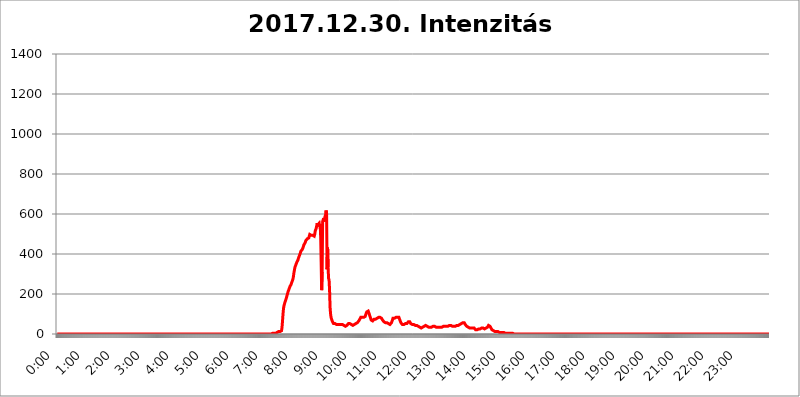
| Category | 2017.12.30. Intenzitás [W/m^2] |
|---|---|
| 0.0 | 0 |
| 0.0006944444444444445 | 0 |
| 0.001388888888888889 | 0 |
| 0.0020833333333333333 | 0 |
| 0.002777777777777778 | 0 |
| 0.003472222222222222 | 0 |
| 0.004166666666666667 | 0 |
| 0.004861111111111111 | 0 |
| 0.005555555555555556 | 0 |
| 0.0062499999999999995 | 0 |
| 0.006944444444444444 | 0 |
| 0.007638888888888889 | 0 |
| 0.008333333333333333 | 0 |
| 0.009027777777777779 | 0 |
| 0.009722222222222222 | 0 |
| 0.010416666666666666 | 0 |
| 0.011111111111111112 | 0 |
| 0.011805555555555555 | 0 |
| 0.012499999999999999 | 0 |
| 0.013194444444444444 | 0 |
| 0.013888888888888888 | 0 |
| 0.014583333333333332 | 0 |
| 0.015277777777777777 | 0 |
| 0.015972222222222224 | 0 |
| 0.016666666666666666 | 0 |
| 0.017361111111111112 | 0 |
| 0.018055555555555557 | 0 |
| 0.01875 | 0 |
| 0.019444444444444445 | 0 |
| 0.02013888888888889 | 0 |
| 0.020833333333333332 | 0 |
| 0.02152777777777778 | 0 |
| 0.022222222222222223 | 0 |
| 0.02291666666666667 | 0 |
| 0.02361111111111111 | 0 |
| 0.024305555555555556 | 0 |
| 0.024999999999999998 | 0 |
| 0.025694444444444447 | 0 |
| 0.02638888888888889 | 0 |
| 0.027083333333333334 | 0 |
| 0.027777777777777776 | 0 |
| 0.02847222222222222 | 0 |
| 0.029166666666666664 | 0 |
| 0.029861111111111113 | 0 |
| 0.030555555555555555 | 0 |
| 0.03125 | 0 |
| 0.03194444444444445 | 0 |
| 0.03263888888888889 | 0 |
| 0.03333333333333333 | 0 |
| 0.034027777777777775 | 0 |
| 0.034722222222222224 | 0 |
| 0.035416666666666666 | 0 |
| 0.036111111111111115 | 0 |
| 0.03680555555555556 | 0 |
| 0.0375 | 0 |
| 0.03819444444444444 | 0 |
| 0.03888888888888889 | 0 |
| 0.03958333333333333 | 0 |
| 0.04027777777777778 | 0 |
| 0.04097222222222222 | 0 |
| 0.041666666666666664 | 0 |
| 0.042361111111111106 | 0 |
| 0.04305555555555556 | 0 |
| 0.043750000000000004 | 0 |
| 0.044444444444444446 | 0 |
| 0.04513888888888889 | 0 |
| 0.04583333333333334 | 0 |
| 0.04652777777777778 | 0 |
| 0.04722222222222222 | 0 |
| 0.04791666666666666 | 0 |
| 0.04861111111111111 | 0 |
| 0.049305555555555554 | 0 |
| 0.049999999999999996 | 0 |
| 0.05069444444444445 | 0 |
| 0.051388888888888894 | 0 |
| 0.052083333333333336 | 0 |
| 0.05277777777777778 | 0 |
| 0.05347222222222222 | 0 |
| 0.05416666666666667 | 0 |
| 0.05486111111111111 | 0 |
| 0.05555555555555555 | 0 |
| 0.05625 | 0 |
| 0.05694444444444444 | 0 |
| 0.057638888888888885 | 0 |
| 0.05833333333333333 | 0 |
| 0.05902777777777778 | 0 |
| 0.059722222222222225 | 0 |
| 0.06041666666666667 | 0 |
| 0.061111111111111116 | 0 |
| 0.06180555555555556 | 0 |
| 0.0625 | 0 |
| 0.06319444444444444 | 0 |
| 0.06388888888888888 | 0 |
| 0.06458333333333334 | 0 |
| 0.06527777777777778 | 0 |
| 0.06597222222222222 | 0 |
| 0.06666666666666667 | 0 |
| 0.06736111111111111 | 0 |
| 0.06805555555555555 | 0 |
| 0.06874999999999999 | 0 |
| 0.06944444444444443 | 0 |
| 0.07013888888888889 | 0 |
| 0.07083333333333333 | 0 |
| 0.07152777777777779 | 0 |
| 0.07222222222222223 | 0 |
| 0.07291666666666667 | 0 |
| 0.07361111111111111 | 0 |
| 0.07430555555555556 | 0 |
| 0.075 | 0 |
| 0.07569444444444444 | 0 |
| 0.0763888888888889 | 0 |
| 0.07708333333333334 | 0 |
| 0.07777777777777778 | 0 |
| 0.07847222222222222 | 0 |
| 0.07916666666666666 | 0 |
| 0.0798611111111111 | 0 |
| 0.08055555555555556 | 0 |
| 0.08125 | 0 |
| 0.08194444444444444 | 0 |
| 0.08263888888888889 | 0 |
| 0.08333333333333333 | 0 |
| 0.08402777777777777 | 0 |
| 0.08472222222222221 | 0 |
| 0.08541666666666665 | 0 |
| 0.08611111111111112 | 0 |
| 0.08680555555555557 | 0 |
| 0.08750000000000001 | 0 |
| 0.08819444444444445 | 0 |
| 0.08888888888888889 | 0 |
| 0.08958333333333333 | 0 |
| 0.09027777777777778 | 0 |
| 0.09097222222222222 | 0 |
| 0.09166666666666667 | 0 |
| 0.09236111111111112 | 0 |
| 0.09305555555555556 | 0 |
| 0.09375 | 0 |
| 0.09444444444444444 | 0 |
| 0.09513888888888888 | 0 |
| 0.09583333333333333 | 0 |
| 0.09652777777777777 | 0 |
| 0.09722222222222222 | 0 |
| 0.09791666666666667 | 0 |
| 0.09861111111111111 | 0 |
| 0.09930555555555555 | 0 |
| 0.09999999999999999 | 0 |
| 0.10069444444444443 | 0 |
| 0.1013888888888889 | 0 |
| 0.10208333333333335 | 0 |
| 0.10277777777777779 | 0 |
| 0.10347222222222223 | 0 |
| 0.10416666666666667 | 0 |
| 0.10486111111111111 | 0 |
| 0.10555555555555556 | 0 |
| 0.10625 | 0 |
| 0.10694444444444444 | 0 |
| 0.1076388888888889 | 0 |
| 0.10833333333333334 | 0 |
| 0.10902777777777778 | 0 |
| 0.10972222222222222 | 0 |
| 0.1111111111111111 | 0 |
| 0.11180555555555556 | 0 |
| 0.11180555555555556 | 0 |
| 0.1125 | 0 |
| 0.11319444444444444 | 0 |
| 0.11388888888888889 | 0 |
| 0.11458333333333333 | 0 |
| 0.11527777777777777 | 0 |
| 0.11597222222222221 | 0 |
| 0.11666666666666665 | 0 |
| 0.1173611111111111 | 0 |
| 0.11805555555555557 | 0 |
| 0.11944444444444445 | 0 |
| 0.12013888888888889 | 0 |
| 0.12083333333333333 | 0 |
| 0.12152777777777778 | 0 |
| 0.12222222222222223 | 0 |
| 0.12291666666666667 | 0 |
| 0.12291666666666667 | 0 |
| 0.12361111111111112 | 0 |
| 0.12430555555555556 | 0 |
| 0.125 | 0 |
| 0.12569444444444444 | 0 |
| 0.12638888888888888 | 0 |
| 0.12708333333333333 | 0 |
| 0.16875 | 0 |
| 0.12847222222222224 | 0 |
| 0.12916666666666668 | 0 |
| 0.12986111111111112 | 0 |
| 0.13055555555555556 | 0 |
| 0.13125 | 0 |
| 0.13194444444444445 | 0 |
| 0.1326388888888889 | 0 |
| 0.13333333333333333 | 0 |
| 0.13402777777777777 | 0 |
| 0.13402777777777777 | 0 |
| 0.13472222222222222 | 0 |
| 0.13541666666666666 | 0 |
| 0.1361111111111111 | 0 |
| 0.13749999999999998 | 0 |
| 0.13819444444444443 | 0 |
| 0.1388888888888889 | 0 |
| 0.13958333333333334 | 0 |
| 0.14027777777777778 | 0 |
| 0.14097222222222222 | 0 |
| 0.14166666666666666 | 0 |
| 0.1423611111111111 | 0 |
| 0.14305555555555557 | 0 |
| 0.14375000000000002 | 0 |
| 0.14444444444444446 | 0 |
| 0.1451388888888889 | 0 |
| 0.1451388888888889 | 0 |
| 0.14652777777777778 | 0 |
| 0.14722222222222223 | 0 |
| 0.14791666666666667 | 0 |
| 0.1486111111111111 | 0 |
| 0.14930555555555555 | 0 |
| 0.15 | 0 |
| 0.15069444444444444 | 0 |
| 0.15138888888888888 | 0 |
| 0.15208333333333332 | 0 |
| 0.15277777777777776 | 0 |
| 0.15347222222222223 | 0 |
| 0.15416666666666667 | 0 |
| 0.15486111111111112 | 0 |
| 0.15555555555555556 | 0 |
| 0.15625 | 0 |
| 0.15694444444444444 | 0 |
| 0.15763888888888888 | 0 |
| 0.15833333333333333 | 0 |
| 0.15902777777777777 | 0 |
| 0.15972222222222224 | 0 |
| 0.16041666666666668 | 0 |
| 0.16111111111111112 | 0 |
| 0.16180555555555556 | 0 |
| 0.1625 | 0 |
| 0.16319444444444445 | 0 |
| 0.1638888888888889 | 0 |
| 0.16458333333333333 | 0 |
| 0.16527777777777777 | 0 |
| 0.16597222222222222 | 0 |
| 0.16666666666666666 | 0 |
| 0.1673611111111111 | 0 |
| 0.16805555555555554 | 0 |
| 0.16874999999999998 | 0 |
| 0.16944444444444443 | 0 |
| 0.17013888888888887 | 0 |
| 0.1708333333333333 | 0 |
| 0.17152777777777775 | 0 |
| 0.17222222222222225 | 0 |
| 0.1729166666666667 | 0 |
| 0.17361111111111113 | 0 |
| 0.17430555555555557 | 0 |
| 0.17500000000000002 | 0 |
| 0.17569444444444446 | 0 |
| 0.1763888888888889 | 0 |
| 0.17708333333333334 | 0 |
| 0.17777777777777778 | 0 |
| 0.17847222222222223 | 0 |
| 0.17916666666666667 | 0 |
| 0.1798611111111111 | 0 |
| 0.18055555555555555 | 0 |
| 0.18125 | 0 |
| 0.18194444444444444 | 0 |
| 0.1826388888888889 | 0 |
| 0.18333333333333335 | 0 |
| 0.1840277777777778 | 0 |
| 0.18472222222222223 | 0 |
| 0.18541666666666667 | 0 |
| 0.18611111111111112 | 0 |
| 0.18680555555555556 | 0 |
| 0.1875 | 0 |
| 0.18819444444444444 | 0 |
| 0.18888888888888888 | 0 |
| 0.18958333333333333 | 0 |
| 0.19027777777777777 | 0 |
| 0.1909722222222222 | 0 |
| 0.19166666666666665 | 0 |
| 0.19236111111111112 | 0 |
| 0.19305555555555554 | 0 |
| 0.19375 | 0 |
| 0.19444444444444445 | 0 |
| 0.1951388888888889 | 0 |
| 0.19583333333333333 | 0 |
| 0.19652777777777777 | 0 |
| 0.19722222222222222 | 0 |
| 0.19791666666666666 | 0 |
| 0.1986111111111111 | 0 |
| 0.19930555555555554 | 0 |
| 0.19999999999999998 | 0 |
| 0.20069444444444443 | 0 |
| 0.20138888888888887 | 0 |
| 0.2020833333333333 | 0 |
| 0.2027777777777778 | 0 |
| 0.2034722222222222 | 0 |
| 0.2041666666666667 | 0 |
| 0.20486111111111113 | 0 |
| 0.20555555555555557 | 0 |
| 0.20625000000000002 | 0 |
| 0.20694444444444446 | 0 |
| 0.2076388888888889 | 0 |
| 0.20833333333333334 | 0 |
| 0.20902777777777778 | 0 |
| 0.20972222222222223 | 0 |
| 0.21041666666666667 | 0 |
| 0.2111111111111111 | 0 |
| 0.21180555555555555 | 0 |
| 0.2125 | 0 |
| 0.21319444444444444 | 0 |
| 0.2138888888888889 | 0 |
| 0.21458333333333335 | 0 |
| 0.2152777777777778 | 0 |
| 0.21597222222222223 | 0 |
| 0.21666666666666667 | 0 |
| 0.21736111111111112 | 0 |
| 0.21805555555555556 | 0 |
| 0.21875 | 0 |
| 0.21944444444444444 | 0 |
| 0.22013888888888888 | 0 |
| 0.22083333333333333 | 0 |
| 0.22152777777777777 | 0 |
| 0.2222222222222222 | 0 |
| 0.22291666666666665 | 0 |
| 0.2236111111111111 | 0 |
| 0.22430555555555556 | 0 |
| 0.225 | 0 |
| 0.22569444444444445 | 0 |
| 0.2263888888888889 | 0 |
| 0.22708333333333333 | 0 |
| 0.22777777777777777 | 0 |
| 0.22847222222222222 | 0 |
| 0.22916666666666666 | 0 |
| 0.2298611111111111 | 0 |
| 0.23055555555555554 | 0 |
| 0.23124999999999998 | 0 |
| 0.23194444444444443 | 0 |
| 0.23263888888888887 | 0 |
| 0.2333333333333333 | 0 |
| 0.2340277777777778 | 0 |
| 0.2347222222222222 | 0 |
| 0.2354166666666667 | 0 |
| 0.23611111111111113 | 0 |
| 0.23680555555555557 | 0 |
| 0.23750000000000002 | 0 |
| 0.23819444444444446 | 0 |
| 0.2388888888888889 | 0 |
| 0.23958333333333334 | 0 |
| 0.24027777777777778 | 0 |
| 0.24097222222222223 | 0 |
| 0.24166666666666667 | 0 |
| 0.2423611111111111 | 0 |
| 0.24305555555555555 | 0 |
| 0.24375 | 0 |
| 0.24444444444444446 | 0 |
| 0.24513888888888888 | 0 |
| 0.24583333333333335 | 0 |
| 0.2465277777777778 | 0 |
| 0.24722222222222223 | 0 |
| 0.24791666666666667 | 0 |
| 0.24861111111111112 | 0 |
| 0.24930555555555556 | 0 |
| 0.25 | 0 |
| 0.25069444444444444 | 0 |
| 0.2513888888888889 | 0 |
| 0.2520833333333333 | 0 |
| 0.25277777777777777 | 0 |
| 0.2534722222222222 | 0 |
| 0.25416666666666665 | 0 |
| 0.2548611111111111 | 0 |
| 0.2555555555555556 | 0 |
| 0.25625000000000003 | 0 |
| 0.2569444444444445 | 0 |
| 0.2576388888888889 | 0 |
| 0.25833333333333336 | 0 |
| 0.2590277777777778 | 0 |
| 0.25972222222222224 | 0 |
| 0.2604166666666667 | 0 |
| 0.2611111111111111 | 0 |
| 0.26180555555555557 | 0 |
| 0.2625 | 0 |
| 0.26319444444444445 | 0 |
| 0.2638888888888889 | 0 |
| 0.26458333333333334 | 0 |
| 0.2652777777777778 | 0 |
| 0.2659722222222222 | 0 |
| 0.26666666666666666 | 0 |
| 0.2673611111111111 | 0 |
| 0.26805555555555555 | 0 |
| 0.26875 | 0 |
| 0.26944444444444443 | 0 |
| 0.2701388888888889 | 0 |
| 0.2708333333333333 | 0 |
| 0.27152777777777776 | 0 |
| 0.2722222222222222 | 0 |
| 0.27291666666666664 | 0 |
| 0.2736111111111111 | 0 |
| 0.2743055555555555 | 0 |
| 0.27499999999999997 | 0 |
| 0.27569444444444446 | 0 |
| 0.27638888888888885 | 0 |
| 0.27708333333333335 | 0 |
| 0.2777777777777778 | 0 |
| 0.27847222222222223 | 0 |
| 0.2791666666666667 | 0 |
| 0.2798611111111111 | 0 |
| 0.28055555555555556 | 0 |
| 0.28125 | 0 |
| 0.28194444444444444 | 0 |
| 0.2826388888888889 | 0 |
| 0.2833333333333333 | 0 |
| 0.28402777777777777 | 0 |
| 0.2847222222222222 | 0 |
| 0.28541666666666665 | 0 |
| 0.28611111111111115 | 0 |
| 0.28680555555555554 | 0 |
| 0.28750000000000003 | 0 |
| 0.2881944444444445 | 0 |
| 0.2888888888888889 | 0 |
| 0.28958333333333336 | 0 |
| 0.2902777777777778 | 0 |
| 0.29097222222222224 | 0 |
| 0.2916666666666667 | 0 |
| 0.2923611111111111 | 0 |
| 0.29305555555555557 | 0 |
| 0.29375 | 0 |
| 0.29444444444444445 | 0 |
| 0.2951388888888889 | 0 |
| 0.29583333333333334 | 0 |
| 0.2965277777777778 | 0 |
| 0.2972222222222222 | 0 |
| 0.29791666666666666 | 0 |
| 0.2986111111111111 | 0 |
| 0.29930555555555555 | 0 |
| 0.3 | 0 |
| 0.30069444444444443 | 0 |
| 0.3013888888888889 | 3.525 |
| 0.3020833333333333 | 3.525 |
| 0.30277777777777776 | 3.525 |
| 0.3034722222222222 | 3.525 |
| 0.30416666666666664 | 3.525 |
| 0.3048611111111111 | 3.525 |
| 0.3055555555555555 | 3.525 |
| 0.30624999999999997 | 3.525 |
| 0.3069444444444444 | 3.525 |
| 0.3076388888888889 | 3.525 |
| 0.30833333333333335 | 7.887 |
| 0.3090277777777778 | 7.887 |
| 0.30972222222222223 | 7.887 |
| 0.3104166666666667 | 12.257 |
| 0.3111111111111111 | 12.257 |
| 0.31180555555555556 | 12.257 |
| 0.3125 | 12.257 |
| 0.31319444444444444 | 12.257 |
| 0.3138888888888889 | 12.257 |
| 0.3145833333333333 | 16.636 |
| 0.31527777777777777 | 34.234 |
| 0.3159722222222222 | 65.31 |
| 0.31666666666666665 | 101.184 |
| 0.31736111111111115 | 128.284 |
| 0.31805555555555554 | 141.884 |
| 0.31875000000000003 | 150.964 |
| 0.3194444444444445 | 160.056 |
| 0.3201388888888889 | 164.605 |
| 0.32083333333333336 | 173.709 |
| 0.3215277777777778 | 182.82 |
| 0.32222222222222224 | 191.937 |
| 0.3229166666666667 | 201.058 |
| 0.3236111111111111 | 210.182 |
| 0.32430555555555557 | 214.746 |
| 0.325 | 223.873 |
| 0.32569444444444445 | 228.436 |
| 0.3263888888888889 | 237.564 |
| 0.32708333333333334 | 242.127 |
| 0.3277777777777778 | 246.689 |
| 0.3284722222222222 | 251.251 |
| 0.32916666666666666 | 260.373 |
| 0.3298611111111111 | 260.373 |
| 0.33055555555555555 | 274.047 |
| 0.33125 | 287.709 |
| 0.33194444444444443 | 305.898 |
| 0.3326388888888889 | 319.517 |
| 0.3333333333333333 | 333.113 |
| 0.3340277777777778 | 337.639 |
| 0.3347222222222222 | 346.682 |
| 0.3354166666666667 | 351.198 |
| 0.3361111111111111 | 360.221 |
| 0.3368055555555556 | 364.728 |
| 0.33749999999999997 | 369.23 |
| 0.33819444444444446 | 378.224 |
| 0.33888888888888885 | 382.715 |
| 0.33958333333333335 | 391.685 |
| 0.34027777777777773 | 396.164 |
| 0.34097222222222223 | 405.108 |
| 0.3416666666666666 | 414.035 |
| 0.3423611111111111 | 414.035 |
| 0.3430555555555555 | 409.574 |
| 0.34375 | 422.943 |
| 0.3444444444444445 | 427.39 |
| 0.3451388888888889 | 436.27 |
| 0.3458333333333334 | 445.129 |
| 0.34652777777777777 | 449.551 |
| 0.34722222222222227 | 449.551 |
| 0.34791666666666665 | 458.38 |
| 0.34861111111111115 | 467.187 |
| 0.34930555555555554 | 471.582 |
| 0.35000000000000003 | 471.582 |
| 0.3506944444444444 | 475.972 |
| 0.3513888888888889 | 475.972 |
| 0.3520833333333333 | 471.582 |
| 0.3527777777777778 | 480.356 |
| 0.3534722222222222 | 484.735 |
| 0.3541666666666667 | 497.836 |
| 0.3548611111111111 | 497.836 |
| 0.35555555555555557 | 497.836 |
| 0.35625 | 493.475 |
| 0.35694444444444445 | 489.108 |
| 0.3576388888888889 | 489.108 |
| 0.35833333333333334 | 493.475 |
| 0.3590277777777778 | 493.475 |
| 0.3597222222222222 | 489.108 |
| 0.36041666666666666 | 489.108 |
| 0.3611111111111111 | 497.836 |
| 0.36180555555555555 | 515.223 |
| 0.3625 | 519.555 |
| 0.36319444444444443 | 528.2 |
| 0.3638888888888889 | 523.88 |
| 0.3645833333333333 | 553.986 |
| 0.3652777777777778 | 545.416 |
| 0.3659722222222222 | 545.416 |
| 0.3666666666666667 | 549.704 |
| 0.3673611111111111 | 553.986 |
| 0.3680555555555556 | 536.82 |
| 0.36874999999999997 | 549.704 |
| 0.36944444444444446 | 493.475 |
| 0.37013888888888885 | 360.221 |
| 0.37083333333333335 | 219.309 |
| 0.37152777777777773 | 310.44 |
| 0.37222222222222223 | 562.53 |
| 0.3729166666666666 | 562.53 |
| 0.3736111111111111 | 579.542 |
| 0.3743055555555555 | 562.53 |
| 0.375 | 558.261 |
| 0.3756944444444445 | 562.53 |
| 0.3763888888888889 | 596.45 |
| 0.3770833333333334 | 617.436 |
| 0.37777777777777777 | 600.661 |
| 0.37847222222222227 | 324.052 |
| 0.37916666666666665 | 431.833 |
| 0.37986111111111115 | 333.113 |
| 0.38055555555555554 | 278.603 |
| 0.38125000000000003 | 269.49 |
| 0.3819444444444444 | 219.309 |
| 0.3826388888888889 | 132.814 |
| 0.3833333333333333 | 101.184 |
| 0.3840277777777778 | 83.205 |
| 0.3847222222222222 | 74.246 |
| 0.3854166666666667 | 69.775 |
| 0.3861111111111111 | 60.85 |
| 0.38680555555555557 | 56.398 |
| 0.3875 | 51.951 |
| 0.38819444444444445 | 51.951 |
| 0.3888888888888889 | 51.951 |
| 0.38958333333333334 | 51.951 |
| 0.3902777777777778 | 47.511 |
| 0.3909722222222222 | 47.511 |
| 0.39166666666666666 | 47.511 |
| 0.3923611111111111 | 47.511 |
| 0.39305555555555555 | 47.511 |
| 0.39375 | 47.511 |
| 0.39444444444444443 | 47.511 |
| 0.3951388888888889 | 47.511 |
| 0.3958333333333333 | 47.511 |
| 0.3965277777777778 | 47.511 |
| 0.3972222222222222 | 47.511 |
| 0.3979166666666667 | 47.511 |
| 0.3986111111111111 | 47.511 |
| 0.3993055555555556 | 47.511 |
| 0.39999999999999997 | 47.511 |
| 0.40069444444444446 | 47.511 |
| 0.40138888888888885 | 47.511 |
| 0.40208333333333335 | 43.079 |
| 0.40277777777777773 | 43.079 |
| 0.40347222222222223 | 38.653 |
| 0.4041666666666666 | 38.653 |
| 0.4048611111111111 | 38.653 |
| 0.4055555555555555 | 43.079 |
| 0.40625 | 43.079 |
| 0.4069444444444445 | 47.511 |
| 0.4076388888888889 | 47.511 |
| 0.4083333333333334 | 51.951 |
| 0.40902777777777777 | 51.951 |
| 0.40972222222222227 | 51.951 |
| 0.41041666666666665 | 51.951 |
| 0.41111111111111115 | 51.951 |
| 0.41180555555555554 | 47.511 |
| 0.41250000000000003 | 47.511 |
| 0.4131944444444444 | 47.511 |
| 0.4138888888888889 | 43.079 |
| 0.4145833333333333 | 43.079 |
| 0.4152777777777778 | 43.079 |
| 0.4159722222222222 | 47.511 |
| 0.4166666666666667 | 47.511 |
| 0.4173611111111111 | 47.511 |
| 0.41805555555555557 | 51.951 |
| 0.41875 | 51.951 |
| 0.41944444444444445 | 56.398 |
| 0.4201388888888889 | 56.398 |
| 0.42083333333333334 | 56.398 |
| 0.4215277777777778 | 56.398 |
| 0.4222222222222222 | 60.85 |
| 0.42291666666666666 | 65.31 |
| 0.4236111111111111 | 69.775 |
| 0.42430555555555555 | 74.246 |
| 0.425 | 78.722 |
| 0.42569444444444443 | 83.205 |
| 0.4263888888888889 | 83.205 |
| 0.4270833333333333 | 83.205 |
| 0.4277777777777778 | 83.205 |
| 0.4284722222222222 | 83.205 |
| 0.4291666666666667 | 83.205 |
| 0.4298611111111111 | 83.205 |
| 0.4305555555555556 | 83.205 |
| 0.43124999999999997 | 87.692 |
| 0.43194444444444446 | 87.692 |
| 0.43263888888888885 | 96.682 |
| 0.43333333333333335 | 101.184 |
| 0.43402777777777773 | 110.201 |
| 0.43472222222222223 | 114.716 |
| 0.4354166666666666 | 114.716 |
| 0.4361111111111111 | 114.716 |
| 0.4368055555555555 | 110.201 |
| 0.4375 | 101.184 |
| 0.4381944444444445 | 92.184 |
| 0.4388888888888889 | 87.692 |
| 0.4395833333333334 | 78.722 |
| 0.44027777777777777 | 69.775 |
| 0.44097222222222227 | 69.775 |
| 0.44166666666666665 | 65.31 |
| 0.44236111111111115 | 65.31 |
| 0.44305555555555554 | 69.775 |
| 0.44375000000000003 | 69.775 |
| 0.4444444444444444 | 74.246 |
| 0.4451388888888889 | 74.246 |
| 0.4458333333333333 | 74.246 |
| 0.4465277777777778 | 74.246 |
| 0.4472222222222222 | 74.246 |
| 0.4479166666666667 | 74.246 |
| 0.4486111111111111 | 78.722 |
| 0.44930555555555557 | 83.205 |
| 0.45 | 83.205 |
| 0.45069444444444445 | 83.205 |
| 0.4513888888888889 | 87.692 |
| 0.45208333333333334 | 87.692 |
| 0.4527777777777778 | 83.205 |
| 0.4534722222222222 | 83.205 |
| 0.45416666666666666 | 83.205 |
| 0.4548611111111111 | 78.722 |
| 0.45555555555555555 | 74.246 |
| 0.45625 | 69.775 |
| 0.45694444444444443 | 69.775 |
| 0.4576388888888889 | 65.31 |
| 0.4583333333333333 | 60.85 |
| 0.4590277777777778 | 60.85 |
| 0.4597222222222222 | 56.398 |
| 0.4604166666666667 | 56.398 |
| 0.4611111111111111 | 56.398 |
| 0.4618055555555556 | 56.398 |
| 0.46249999999999997 | 56.398 |
| 0.46319444444444446 | 56.398 |
| 0.46388888888888885 | 56.398 |
| 0.46458333333333335 | 51.951 |
| 0.46527777777777773 | 51.951 |
| 0.46597222222222223 | 51.951 |
| 0.4666666666666666 | 47.511 |
| 0.4673611111111111 | 47.511 |
| 0.4680555555555555 | 51.951 |
| 0.46875 | 56.398 |
| 0.4694444444444445 | 60.85 |
| 0.4701388888888889 | 69.775 |
| 0.4708333333333334 | 78.722 |
| 0.47152777777777777 | 78.722 |
| 0.47222222222222227 | 74.246 |
| 0.47291666666666665 | 78.722 |
| 0.47361111111111115 | 78.722 |
| 0.47430555555555554 | 78.722 |
| 0.47500000000000003 | 83.205 |
| 0.4756944444444444 | 78.722 |
| 0.4763888888888889 | 78.722 |
| 0.4770833333333333 | 83.205 |
| 0.4777777777777778 | 87.692 |
| 0.4784722222222222 | 87.692 |
| 0.4791666666666667 | 83.205 |
| 0.4798611111111111 | 78.722 |
| 0.48055555555555557 | 69.775 |
| 0.48125 | 65.31 |
| 0.48194444444444445 | 56.398 |
| 0.4826388888888889 | 56.398 |
| 0.48333333333333334 | 51.951 |
| 0.4840277777777778 | 47.511 |
| 0.4847222222222222 | 47.511 |
| 0.48541666666666666 | 47.511 |
| 0.4861111111111111 | 47.511 |
| 0.48680555555555555 | 47.511 |
| 0.4875 | 47.511 |
| 0.48819444444444443 | 51.951 |
| 0.4888888888888889 | 51.951 |
| 0.4895833333333333 | 51.951 |
| 0.4902777777777778 | 51.951 |
| 0.4909722222222222 | 56.398 |
| 0.4916666666666667 | 56.398 |
| 0.4923611111111111 | 60.85 |
| 0.4930555555555556 | 65.31 |
| 0.49374999999999997 | 60.85 |
| 0.49444444444444446 | 60.85 |
| 0.49513888888888885 | 56.398 |
| 0.49583333333333335 | 51.951 |
| 0.49652777777777773 | 47.511 |
| 0.49722222222222223 | 47.511 |
| 0.4979166666666666 | 47.511 |
| 0.4986111111111111 | 47.511 |
| 0.4993055555555555 | 47.511 |
| 0.5 | 47.511 |
| 0.5006944444444444 | 47.511 |
| 0.5013888888888889 | 43.079 |
| 0.5020833333333333 | 43.079 |
| 0.5027777777777778 | 43.079 |
| 0.5034722222222222 | 43.079 |
| 0.5041666666666667 | 43.079 |
| 0.5048611111111111 | 43.079 |
| 0.5055555555555555 | 38.653 |
| 0.50625 | 38.653 |
| 0.5069444444444444 | 34.234 |
| 0.5076388888888889 | 34.234 |
| 0.5083333333333333 | 34.234 |
| 0.5090277777777777 | 34.234 |
| 0.5097222222222222 | 29.823 |
| 0.5104166666666666 | 29.823 |
| 0.5111111111111112 | 29.823 |
| 0.5118055555555555 | 29.823 |
| 0.5125000000000001 | 34.234 |
| 0.5131944444444444 | 34.234 |
| 0.513888888888889 | 38.653 |
| 0.5145833333333333 | 38.653 |
| 0.5152777777777778 | 38.653 |
| 0.5159722222222222 | 38.653 |
| 0.5166666666666667 | 43.079 |
| 0.517361111111111 | 43.079 |
| 0.5180555555555556 | 38.653 |
| 0.5187499999999999 | 38.653 |
| 0.5194444444444445 | 34.234 |
| 0.5201388888888888 | 34.234 |
| 0.5208333333333334 | 34.234 |
| 0.5215277777777778 | 34.234 |
| 0.5222222222222223 | 34.234 |
| 0.5229166666666667 | 34.234 |
| 0.5236111111111111 | 34.234 |
| 0.5243055555555556 | 34.234 |
| 0.525 | 34.234 |
| 0.5256944444444445 | 34.234 |
| 0.5263888888888889 | 38.653 |
| 0.5270833333333333 | 38.653 |
| 0.5277777777777778 | 43.079 |
| 0.5284722222222222 | 43.079 |
| 0.5291666666666667 | 38.653 |
| 0.5298611111111111 | 38.653 |
| 0.5305555555555556 | 38.653 |
| 0.53125 | 34.234 |
| 0.5319444444444444 | 34.234 |
| 0.5326388888888889 | 34.234 |
| 0.5333333333333333 | 34.234 |
| 0.5340277777777778 | 34.234 |
| 0.5347222222222222 | 34.234 |
| 0.5354166666666667 | 34.234 |
| 0.5361111111111111 | 34.234 |
| 0.5368055555555555 | 34.234 |
| 0.5375 | 34.234 |
| 0.5381944444444444 | 34.234 |
| 0.5388888888888889 | 34.234 |
| 0.5395833333333333 | 34.234 |
| 0.5402777777777777 | 34.234 |
| 0.5409722222222222 | 38.653 |
| 0.5416666666666666 | 38.653 |
| 0.5423611111111112 | 38.653 |
| 0.5430555555555555 | 38.653 |
| 0.5437500000000001 | 38.653 |
| 0.5444444444444444 | 38.653 |
| 0.545138888888889 | 38.653 |
| 0.5458333333333333 | 38.653 |
| 0.5465277777777778 | 38.653 |
| 0.5472222222222222 | 38.653 |
| 0.5479166666666667 | 38.653 |
| 0.548611111111111 | 43.079 |
| 0.5493055555555556 | 43.079 |
| 0.5499999999999999 | 43.079 |
| 0.5506944444444445 | 43.079 |
| 0.5513888888888888 | 47.511 |
| 0.5520833333333334 | 43.079 |
| 0.5527777777777778 | 43.079 |
| 0.5534722222222223 | 38.653 |
| 0.5541666666666667 | 38.653 |
| 0.5548611111111111 | 38.653 |
| 0.5555555555555556 | 38.653 |
| 0.55625 | 38.653 |
| 0.5569444444444445 | 38.653 |
| 0.5576388888888889 | 38.653 |
| 0.5583333333333333 | 38.653 |
| 0.5590277777777778 | 38.653 |
| 0.5597222222222222 | 38.653 |
| 0.5604166666666667 | 43.079 |
| 0.5611111111111111 | 43.079 |
| 0.5618055555555556 | 43.079 |
| 0.5625 | 43.079 |
| 0.5631944444444444 | 47.511 |
| 0.5638888888888889 | 47.511 |
| 0.5645833333333333 | 47.511 |
| 0.5652777777777778 | 47.511 |
| 0.5659722222222222 | 47.511 |
| 0.5666666666666667 | 51.951 |
| 0.5673611111111111 | 56.398 |
| 0.5680555555555555 | 56.398 |
| 0.56875 | 56.398 |
| 0.5694444444444444 | 56.398 |
| 0.5701388888888889 | 56.398 |
| 0.5708333333333333 | 56.398 |
| 0.5715277777777777 | 51.951 |
| 0.5722222222222222 | 47.511 |
| 0.5729166666666666 | 47.511 |
| 0.5736111111111112 | 43.079 |
| 0.5743055555555555 | 38.653 |
| 0.5750000000000001 | 38.653 |
| 0.5756944444444444 | 34.234 |
| 0.576388888888889 | 34.234 |
| 0.5770833333333333 | 34.234 |
| 0.5777777777777778 | 34.234 |
| 0.5784722222222222 | 29.823 |
| 0.5791666666666667 | 29.823 |
| 0.579861111111111 | 29.823 |
| 0.5805555555555556 | 29.823 |
| 0.5812499999999999 | 25.419 |
| 0.5819444444444445 | 29.823 |
| 0.5826388888888888 | 29.823 |
| 0.5833333333333334 | 29.823 |
| 0.5840277777777778 | 29.823 |
| 0.5847222222222223 | 29.823 |
| 0.5854166666666667 | 29.823 |
| 0.5861111111111111 | 25.419 |
| 0.5868055555555556 | 21.024 |
| 0.5875 | 21.024 |
| 0.5881944444444445 | 21.024 |
| 0.5888888888888889 | 21.024 |
| 0.5895833333333333 | 21.024 |
| 0.5902777777777778 | 21.024 |
| 0.5909722222222222 | 25.419 |
| 0.5916666666666667 | 25.419 |
| 0.5923611111111111 | 25.419 |
| 0.5930555555555556 | 25.419 |
| 0.59375 | 29.823 |
| 0.5944444444444444 | 29.823 |
| 0.5951388888888889 | 29.823 |
| 0.5958333333333333 | 34.234 |
| 0.5965277777777778 | 29.823 |
| 0.5972222222222222 | 29.823 |
| 0.5979166666666667 | 29.823 |
| 0.5986111111111111 | 25.419 |
| 0.5993055555555555 | 25.419 |
| 0.6 | 25.419 |
| 0.6006944444444444 | 25.419 |
| 0.6013888888888889 | 29.823 |
| 0.6020833333333333 | 29.823 |
| 0.6027777777777777 | 34.234 |
| 0.6034722222222222 | 34.234 |
| 0.6041666666666666 | 38.653 |
| 0.6048611111111112 | 43.079 |
| 0.6055555555555555 | 43.079 |
| 0.6062500000000001 | 43.079 |
| 0.6069444444444444 | 38.653 |
| 0.607638888888889 | 34.234 |
| 0.6083333333333333 | 29.823 |
| 0.6090277777777778 | 25.419 |
| 0.6097222222222222 | 21.024 |
| 0.6104166666666667 | 21.024 |
| 0.611111111111111 | 16.636 |
| 0.6118055555555556 | 16.636 |
| 0.6124999999999999 | 12.257 |
| 0.6131944444444445 | 12.257 |
| 0.6138888888888888 | 12.257 |
| 0.6145833333333334 | 12.257 |
| 0.6152777777777778 | 12.257 |
| 0.6159722222222223 | 12.257 |
| 0.6166666666666667 | 12.257 |
| 0.6173611111111111 | 7.887 |
| 0.6180555555555556 | 12.257 |
| 0.61875 | 12.257 |
| 0.6194444444444445 | 7.887 |
| 0.6201388888888889 | 7.887 |
| 0.6208333333333333 | 7.887 |
| 0.6215277777777778 | 7.887 |
| 0.6222222222222222 | 7.887 |
| 0.6229166666666667 | 7.887 |
| 0.6236111111111111 | 7.887 |
| 0.6243055555555556 | 7.887 |
| 0.625 | 7.887 |
| 0.6256944444444444 | 7.887 |
| 0.6263888888888889 | 7.887 |
| 0.6270833333333333 | 7.887 |
| 0.6277777777777778 | 3.525 |
| 0.6284722222222222 | 3.525 |
| 0.6291666666666667 | 3.525 |
| 0.6298611111111111 | 3.525 |
| 0.6305555555555555 | 3.525 |
| 0.63125 | 3.525 |
| 0.6319444444444444 | 3.525 |
| 0.6326388888888889 | 3.525 |
| 0.6333333333333333 | 3.525 |
| 0.6340277777777777 | 3.525 |
| 0.6347222222222222 | 3.525 |
| 0.6354166666666666 | 3.525 |
| 0.6361111111111112 | 3.525 |
| 0.6368055555555555 | 3.525 |
| 0.6375000000000001 | 3.525 |
| 0.6381944444444444 | 3.525 |
| 0.638888888888889 | 3.525 |
| 0.6395833333333333 | 3.525 |
| 0.6402777777777778 | 3.525 |
| 0.6409722222222222 | 0 |
| 0.6416666666666667 | 3.525 |
| 0.642361111111111 | 0 |
| 0.6430555555555556 | 0 |
| 0.6437499999999999 | 0 |
| 0.6444444444444445 | 0 |
| 0.6451388888888888 | 0 |
| 0.6458333333333334 | 0 |
| 0.6465277777777778 | 0 |
| 0.6472222222222223 | 0 |
| 0.6479166666666667 | 0 |
| 0.6486111111111111 | 0 |
| 0.6493055555555556 | 0 |
| 0.65 | 0 |
| 0.6506944444444445 | 0 |
| 0.6513888888888889 | 0 |
| 0.6520833333333333 | 0 |
| 0.6527777777777778 | 0 |
| 0.6534722222222222 | 0 |
| 0.6541666666666667 | 0 |
| 0.6548611111111111 | 0 |
| 0.6555555555555556 | 0 |
| 0.65625 | 0 |
| 0.6569444444444444 | 0 |
| 0.6576388888888889 | 0 |
| 0.6583333333333333 | 0 |
| 0.6590277777777778 | 0 |
| 0.6597222222222222 | 0 |
| 0.6604166666666667 | 0 |
| 0.6611111111111111 | 0 |
| 0.6618055555555555 | 0 |
| 0.6625 | 0 |
| 0.6631944444444444 | 0 |
| 0.6638888888888889 | 0 |
| 0.6645833333333333 | 0 |
| 0.6652777777777777 | 0 |
| 0.6659722222222222 | 0 |
| 0.6666666666666666 | 0 |
| 0.6673611111111111 | 0 |
| 0.6680555555555556 | 0 |
| 0.6687500000000001 | 0 |
| 0.6694444444444444 | 0 |
| 0.6701388888888888 | 0 |
| 0.6708333333333334 | 0 |
| 0.6715277777777778 | 0 |
| 0.6722222222222222 | 0 |
| 0.6729166666666666 | 0 |
| 0.6736111111111112 | 0 |
| 0.6743055555555556 | 0 |
| 0.6749999999999999 | 0 |
| 0.6756944444444444 | 0 |
| 0.6763888888888889 | 0 |
| 0.6770833333333334 | 0 |
| 0.6777777777777777 | 0 |
| 0.6784722222222223 | 0 |
| 0.6791666666666667 | 0 |
| 0.6798611111111111 | 0 |
| 0.6805555555555555 | 0 |
| 0.68125 | 0 |
| 0.6819444444444445 | 0 |
| 0.6826388888888889 | 0 |
| 0.6833333333333332 | 0 |
| 0.6840277777777778 | 0 |
| 0.6847222222222222 | 0 |
| 0.6854166666666667 | 0 |
| 0.686111111111111 | 0 |
| 0.6868055555555556 | 0 |
| 0.6875 | 0 |
| 0.6881944444444444 | 0 |
| 0.688888888888889 | 0 |
| 0.6895833333333333 | 0 |
| 0.6902777777777778 | 0 |
| 0.6909722222222222 | 0 |
| 0.6916666666666668 | 0 |
| 0.6923611111111111 | 0 |
| 0.6930555555555555 | 0 |
| 0.69375 | 0 |
| 0.6944444444444445 | 0 |
| 0.6951388888888889 | 0 |
| 0.6958333333333333 | 0 |
| 0.6965277777777777 | 0 |
| 0.6972222222222223 | 0 |
| 0.6979166666666666 | 0 |
| 0.6986111111111111 | 0 |
| 0.6993055555555556 | 0 |
| 0.7000000000000001 | 0 |
| 0.7006944444444444 | 0 |
| 0.7013888888888888 | 0 |
| 0.7020833333333334 | 0 |
| 0.7027777777777778 | 0 |
| 0.7034722222222222 | 0 |
| 0.7041666666666666 | 0 |
| 0.7048611111111112 | 0 |
| 0.7055555555555556 | 0 |
| 0.7062499999999999 | 0 |
| 0.7069444444444444 | 0 |
| 0.7076388888888889 | 0 |
| 0.7083333333333334 | 0 |
| 0.7090277777777777 | 0 |
| 0.7097222222222223 | 0 |
| 0.7104166666666667 | 0 |
| 0.7111111111111111 | 0 |
| 0.7118055555555555 | 0 |
| 0.7125 | 0 |
| 0.7131944444444445 | 0 |
| 0.7138888888888889 | 0 |
| 0.7145833333333332 | 0 |
| 0.7152777777777778 | 0 |
| 0.7159722222222222 | 0 |
| 0.7166666666666667 | 0 |
| 0.717361111111111 | 0 |
| 0.7180555555555556 | 0 |
| 0.71875 | 0 |
| 0.7194444444444444 | 0 |
| 0.720138888888889 | 0 |
| 0.7208333333333333 | 0 |
| 0.7215277777777778 | 0 |
| 0.7222222222222222 | 0 |
| 0.7229166666666668 | 0 |
| 0.7236111111111111 | 0 |
| 0.7243055555555555 | 0 |
| 0.725 | 0 |
| 0.7256944444444445 | 0 |
| 0.7263888888888889 | 0 |
| 0.7270833333333333 | 0 |
| 0.7277777777777777 | 0 |
| 0.7284722222222223 | 0 |
| 0.7291666666666666 | 0 |
| 0.7298611111111111 | 0 |
| 0.7305555555555556 | 0 |
| 0.7312500000000001 | 0 |
| 0.7319444444444444 | 0 |
| 0.7326388888888888 | 0 |
| 0.7333333333333334 | 0 |
| 0.7340277777777778 | 0 |
| 0.7347222222222222 | 0 |
| 0.7354166666666666 | 0 |
| 0.7361111111111112 | 0 |
| 0.7368055555555556 | 0 |
| 0.7374999999999999 | 0 |
| 0.7381944444444444 | 0 |
| 0.7388888888888889 | 0 |
| 0.7395833333333334 | 0 |
| 0.7402777777777777 | 0 |
| 0.7409722222222223 | 0 |
| 0.7416666666666667 | 0 |
| 0.7423611111111111 | 0 |
| 0.7430555555555555 | 0 |
| 0.74375 | 0 |
| 0.7444444444444445 | 0 |
| 0.7451388888888889 | 0 |
| 0.7458333333333332 | 0 |
| 0.7465277777777778 | 0 |
| 0.7472222222222222 | 0 |
| 0.7479166666666667 | 0 |
| 0.748611111111111 | 0 |
| 0.7493055555555556 | 0 |
| 0.75 | 0 |
| 0.7506944444444444 | 0 |
| 0.751388888888889 | 0 |
| 0.7520833333333333 | 0 |
| 0.7527777777777778 | 0 |
| 0.7534722222222222 | 0 |
| 0.7541666666666668 | 0 |
| 0.7548611111111111 | 0 |
| 0.7555555555555555 | 0 |
| 0.75625 | 0 |
| 0.7569444444444445 | 0 |
| 0.7576388888888889 | 0 |
| 0.7583333333333333 | 0 |
| 0.7590277777777777 | 0 |
| 0.7597222222222223 | 0 |
| 0.7604166666666666 | 0 |
| 0.7611111111111111 | 0 |
| 0.7618055555555556 | 0 |
| 0.7625000000000001 | 0 |
| 0.7631944444444444 | 0 |
| 0.7638888888888888 | 0 |
| 0.7645833333333334 | 0 |
| 0.7652777777777778 | 0 |
| 0.7659722222222222 | 0 |
| 0.7666666666666666 | 0 |
| 0.7673611111111112 | 0 |
| 0.7680555555555556 | 0 |
| 0.7687499999999999 | 0 |
| 0.7694444444444444 | 0 |
| 0.7701388888888889 | 0 |
| 0.7708333333333334 | 0 |
| 0.7715277777777777 | 0 |
| 0.7722222222222223 | 0 |
| 0.7729166666666667 | 0 |
| 0.7736111111111111 | 0 |
| 0.7743055555555555 | 0 |
| 0.775 | 0 |
| 0.7756944444444445 | 0 |
| 0.7763888888888889 | 0 |
| 0.7770833333333332 | 0 |
| 0.7777777777777778 | 0 |
| 0.7784722222222222 | 0 |
| 0.7791666666666667 | 0 |
| 0.779861111111111 | 0 |
| 0.7805555555555556 | 0 |
| 0.78125 | 0 |
| 0.7819444444444444 | 0 |
| 0.782638888888889 | 0 |
| 0.7833333333333333 | 0 |
| 0.7840277777777778 | 0 |
| 0.7847222222222222 | 0 |
| 0.7854166666666668 | 0 |
| 0.7861111111111111 | 0 |
| 0.7868055555555555 | 0 |
| 0.7875 | 0 |
| 0.7881944444444445 | 0 |
| 0.7888888888888889 | 0 |
| 0.7895833333333333 | 0 |
| 0.7902777777777777 | 0 |
| 0.7909722222222223 | 0 |
| 0.7916666666666666 | 0 |
| 0.7923611111111111 | 0 |
| 0.7930555555555556 | 0 |
| 0.7937500000000001 | 0 |
| 0.7944444444444444 | 0 |
| 0.7951388888888888 | 0 |
| 0.7958333333333334 | 0 |
| 0.7965277777777778 | 0 |
| 0.7972222222222222 | 0 |
| 0.7979166666666666 | 0 |
| 0.7986111111111112 | 0 |
| 0.7993055555555556 | 0 |
| 0.7999999999999999 | 0 |
| 0.8006944444444444 | 0 |
| 0.8013888888888889 | 0 |
| 0.8020833333333334 | 0 |
| 0.8027777777777777 | 0 |
| 0.8034722222222223 | 0 |
| 0.8041666666666667 | 0 |
| 0.8048611111111111 | 0 |
| 0.8055555555555555 | 0 |
| 0.80625 | 0 |
| 0.8069444444444445 | 0 |
| 0.8076388888888889 | 0 |
| 0.8083333333333332 | 0 |
| 0.8090277777777778 | 0 |
| 0.8097222222222222 | 0 |
| 0.8104166666666667 | 0 |
| 0.811111111111111 | 0 |
| 0.8118055555555556 | 0 |
| 0.8125 | 0 |
| 0.8131944444444444 | 0 |
| 0.813888888888889 | 0 |
| 0.8145833333333333 | 0 |
| 0.8152777777777778 | 0 |
| 0.8159722222222222 | 0 |
| 0.8166666666666668 | 0 |
| 0.8173611111111111 | 0 |
| 0.8180555555555555 | 0 |
| 0.81875 | 0 |
| 0.8194444444444445 | 0 |
| 0.8201388888888889 | 0 |
| 0.8208333333333333 | 0 |
| 0.8215277777777777 | 0 |
| 0.8222222222222223 | 0 |
| 0.8229166666666666 | 0 |
| 0.8236111111111111 | 0 |
| 0.8243055555555556 | 0 |
| 0.8250000000000001 | 0 |
| 0.8256944444444444 | 0 |
| 0.8263888888888888 | 0 |
| 0.8270833333333334 | 0 |
| 0.8277777777777778 | 0 |
| 0.8284722222222222 | 0 |
| 0.8291666666666666 | 0 |
| 0.8298611111111112 | 0 |
| 0.8305555555555556 | 0 |
| 0.8312499999999999 | 0 |
| 0.8319444444444444 | 0 |
| 0.8326388888888889 | 0 |
| 0.8333333333333334 | 0 |
| 0.8340277777777777 | 0 |
| 0.8347222222222223 | 0 |
| 0.8354166666666667 | 0 |
| 0.8361111111111111 | 0 |
| 0.8368055555555555 | 0 |
| 0.8375 | 0 |
| 0.8381944444444445 | 0 |
| 0.8388888888888889 | 0 |
| 0.8395833333333332 | 0 |
| 0.8402777777777778 | 0 |
| 0.8409722222222222 | 0 |
| 0.8416666666666667 | 0 |
| 0.842361111111111 | 0 |
| 0.8430555555555556 | 0 |
| 0.84375 | 0 |
| 0.8444444444444444 | 0 |
| 0.845138888888889 | 0 |
| 0.8458333333333333 | 0 |
| 0.8465277777777778 | 0 |
| 0.8472222222222222 | 0 |
| 0.8479166666666668 | 0 |
| 0.8486111111111111 | 0 |
| 0.8493055555555555 | 0 |
| 0.85 | 0 |
| 0.8506944444444445 | 0 |
| 0.8513888888888889 | 0 |
| 0.8520833333333333 | 0 |
| 0.8527777777777777 | 0 |
| 0.8534722222222223 | 0 |
| 0.8541666666666666 | 0 |
| 0.8548611111111111 | 0 |
| 0.8555555555555556 | 0 |
| 0.8562500000000001 | 0 |
| 0.8569444444444444 | 0 |
| 0.8576388888888888 | 0 |
| 0.8583333333333334 | 0 |
| 0.8590277777777778 | 0 |
| 0.8597222222222222 | 0 |
| 0.8604166666666666 | 0 |
| 0.8611111111111112 | 0 |
| 0.8618055555555556 | 0 |
| 0.8624999999999999 | 0 |
| 0.8631944444444444 | 0 |
| 0.8638888888888889 | 0 |
| 0.8645833333333334 | 0 |
| 0.8652777777777777 | 0 |
| 0.8659722222222223 | 0 |
| 0.8666666666666667 | 0 |
| 0.8673611111111111 | 0 |
| 0.8680555555555555 | 0 |
| 0.86875 | 0 |
| 0.8694444444444445 | 0 |
| 0.8701388888888889 | 0 |
| 0.8708333333333332 | 0 |
| 0.8715277777777778 | 0 |
| 0.8722222222222222 | 0 |
| 0.8729166666666667 | 0 |
| 0.873611111111111 | 0 |
| 0.8743055555555556 | 0 |
| 0.875 | 0 |
| 0.8756944444444444 | 0 |
| 0.876388888888889 | 0 |
| 0.8770833333333333 | 0 |
| 0.8777777777777778 | 0 |
| 0.8784722222222222 | 0 |
| 0.8791666666666668 | 0 |
| 0.8798611111111111 | 0 |
| 0.8805555555555555 | 0 |
| 0.88125 | 0 |
| 0.8819444444444445 | 0 |
| 0.8826388888888889 | 0 |
| 0.8833333333333333 | 0 |
| 0.8840277777777777 | 0 |
| 0.8847222222222223 | 0 |
| 0.8854166666666666 | 0 |
| 0.8861111111111111 | 0 |
| 0.8868055555555556 | 0 |
| 0.8875000000000001 | 0 |
| 0.8881944444444444 | 0 |
| 0.8888888888888888 | 0 |
| 0.8895833333333334 | 0 |
| 0.8902777777777778 | 0 |
| 0.8909722222222222 | 0 |
| 0.8916666666666666 | 0 |
| 0.8923611111111112 | 0 |
| 0.8930555555555556 | 0 |
| 0.8937499999999999 | 0 |
| 0.8944444444444444 | 0 |
| 0.8951388888888889 | 0 |
| 0.8958333333333334 | 0 |
| 0.8965277777777777 | 0 |
| 0.8972222222222223 | 0 |
| 0.8979166666666667 | 0 |
| 0.8986111111111111 | 0 |
| 0.8993055555555555 | 0 |
| 0.9 | 0 |
| 0.9006944444444445 | 0 |
| 0.9013888888888889 | 0 |
| 0.9020833333333332 | 0 |
| 0.9027777777777778 | 0 |
| 0.9034722222222222 | 0 |
| 0.9041666666666667 | 0 |
| 0.904861111111111 | 0 |
| 0.9055555555555556 | 0 |
| 0.90625 | 0 |
| 0.9069444444444444 | 0 |
| 0.907638888888889 | 0 |
| 0.9083333333333333 | 0 |
| 0.9090277777777778 | 0 |
| 0.9097222222222222 | 0 |
| 0.9104166666666668 | 0 |
| 0.9111111111111111 | 0 |
| 0.9118055555555555 | 0 |
| 0.9125 | 0 |
| 0.9131944444444445 | 0 |
| 0.9138888888888889 | 0 |
| 0.9145833333333333 | 0 |
| 0.9152777777777777 | 0 |
| 0.9159722222222223 | 0 |
| 0.9166666666666666 | 0 |
| 0.9173611111111111 | 0 |
| 0.9180555555555556 | 0 |
| 0.9187500000000001 | 0 |
| 0.9194444444444444 | 0 |
| 0.9201388888888888 | 0 |
| 0.9208333333333334 | 0 |
| 0.9215277777777778 | 0 |
| 0.9222222222222222 | 0 |
| 0.9229166666666666 | 0 |
| 0.9236111111111112 | 0 |
| 0.9243055555555556 | 0 |
| 0.9249999999999999 | 0 |
| 0.9256944444444444 | 0 |
| 0.9263888888888889 | 0 |
| 0.9270833333333334 | 0 |
| 0.9277777777777777 | 0 |
| 0.9284722222222223 | 0 |
| 0.9291666666666667 | 0 |
| 0.9298611111111111 | 0 |
| 0.9305555555555555 | 0 |
| 0.93125 | 0 |
| 0.9319444444444445 | 0 |
| 0.9326388888888889 | 0 |
| 0.9333333333333332 | 0 |
| 0.9340277777777778 | 0 |
| 0.9347222222222222 | 0 |
| 0.9354166666666667 | 0 |
| 0.936111111111111 | 0 |
| 0.9368055555555556 | 0 |
| 0.9375 | 0 |
| 0.9381944444444444 | 0 |
| 0.938888888888889 | 0 |
| 0.9395833333333333 | 0 |
| 0.9402777777777778 | 0 |
| 0.9409722222222222 | 0 |
| 0.9416666666666668 | 0 |
| 0.9423611111111111 | 0 |
| 0.9430555555555555 | 0 |
| 0.94375 | 0 |
| 0.9444444444444445 | 0 |
| 0.9451388888888889 | 0 |
| 0.9458333333333333 | 0 |
| 0.9465277777777777 | 0 |
| 0.9472222222222223 | 0 |
| 0.9479166666666666 | 0 |
| 0.9486111111111111 | 0 |
| 0.9493055555555556 | 0 |
| 0.9500000000000001 | 0 |
| 0.9506944444444444 | 0 |
| 0.9513888888888888 | 0 |
| 0.9520833333333334 | 0 |
| 0.9527777777777778 | 0 |
| 0.9534722222222222 | 0 |
| 0.9541666666666666 | 0 |
| 0.9548611111111112 | 0 |
| 0.9555555555555556 | 0 |
| 0.9562499999999999 | 0 |
| 0.9569444444444444 | 0 |
| 0.9576388888888889 | 0 |
| 0.9583333333333334 | 0 |
| 0.9590277777777777 | 0 |
| 0.9597222222222223 | 0 |
| 0.9604166666666667 | 0 |
| 0.9611111111111111 | 0 |
| 0.9618055555555555 | 0 |
| 0.9625 | 0 |
| 0.9631944444444445 | 0 |
| 0.9638888888888889 | 0 |
| 0.9645833333333332 | 0 |
| 0.9652777777777778 | 0 |
| 0.9659722222222222 | 0 |
| 0.9666666666666667 | 0 |
| 0.967361111111111 | 0 |
| 0.9680555555555556 | 0 |
| 0.96875 | 0 |
| 0.9694444444444444 | 0 |
| 0.970138888888889 | 0 |
| 0.9708333333333333 | 0 |
| 0.9715277777777778 | 0 |
| 0.9722222222222222 | 0 |
| 0.9729166666666668 | 0 |
| 0.9736111111111111 | 0 |
| 0.9743055555555555 | 0 |
| 0.975 | 0 |
| 0.9756944444444445 | 0 |
| 0.9763888888888889 | 0 |
| 0.9770833333333333 | 0 |
| 0.9777777777777777 | 0 |
| 0.9784722222222223 | 0 |
| 0.9791666666666666 | 0 |
| 0.9798611111111111 | 0 |
| 0.9805555555555556 | 0 |
| 0.9812500000000001 | 0 |
| 0.9819444444444444 | 0 |
| 0.9826388888888888 | 0 |
| 0.9833333333333334 | 0 |
| 0.9840277777777778 | 0 |
| 0.9847222222222222 | 0 |
| 0.9854166666666666 | 0 |
| 0.9861111111111112 | 0 |
| 0.9868055555555556 | 0 |
| 0.9874999999999999 | 0 |
| 0.9881944444444444 | 0 |
| 0.9888888888888889 | 0 |
| 0.9895833333333334 | 0 |
| 0.9902777777777777 | 0 |
| 0.9909722222222223 | 0 |
| 0.9916666666666667 | 0 |
| 0.9923611111111111 | 0 |
| 0.9930555555555555 | 0 |
| 0.99375 | 0 |
| 0.9944444444444445 | 0 |
| 0.9951388888888889 | 0 |
| 0.9958333333333332 | 0 |
| 0.9965277777777778 | 0 |
| 0.9972222222222222 | 0 |
| 0.9979166666666667 | 0 |
| 0.998611111111111 | 0 |
| 0.9993055555555556 | 0 |